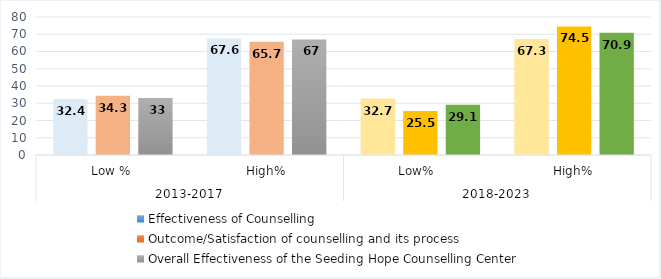
| Category | Effectiveness of Counselling | Outcome/Satisfaction of counselling and its process | Overall Effectiveness of the Seeding Hope Counselling Center |
|---|---|---|---|
| 0 | 32.4 | 34.3 | 33 |
| 1 | 67.6 | 65.7 | 67 |
| 2 | 32.7 | 25.5 | 29.1 |
| 3 | 67.3 | 74.5 | 70.9 |